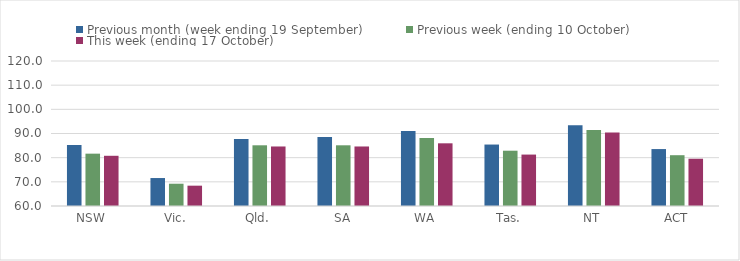
| Category | Previous month (week ending 19 September) | Previous week (ending 10 October) | This week (ending 17 October) |
|---|---|---|---|
| NSW | 85.25 | 81.66 | 80.78 |
| Vic. | 71.57 | 69.22 | 68.41 |
| Qld. | 87.75 | 85.12 | 84.63 |
| SA | 88.53 | 85.12 | 84.63 |
| WA | 90.99 | 88.17 | 85.94 |
| Tas. | 85.43 | 82.88 | 81.28 |
| NT | 93.42 | 91.42 | 90.41 |
| ACT | 83.56 | 81.02 | 79.56 |